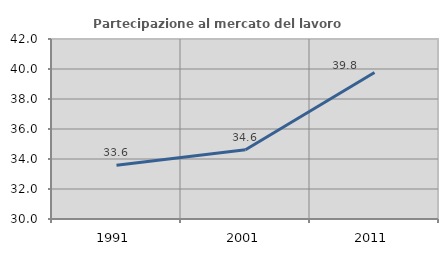
| Category | Partecipazione al mercato del lavoro  femminile |
|---|---|
| 1991.0 | 33.586 |
| 2001.0 | 34.611 |
| 2011.0 | 39.764 |